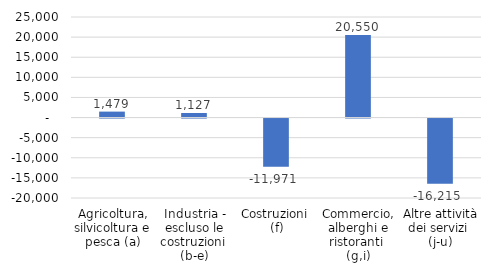
| Category | Series 0 |
|---|---|
| Agricoltura, silvicoltura e pesca (a) | 1479 |
| Industria - escluso le costruzioni 
(b-e) | 1127 |
| Costruzioni 
(f) | -11971 |
| Commercio, alberghi e ristoranti 
(g,i) | 20550 |
| Altre attività dei servizi 
(j-u) | -16215 |